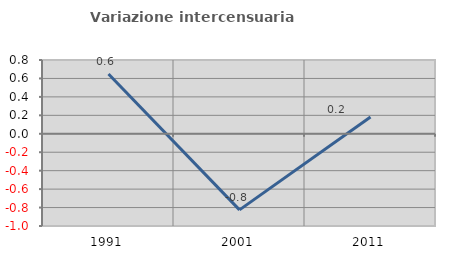
| Category | Variazione intercensuaria annua |
|---|---|
| 1991.0 | 0.649 |
| 2001.0 | -0.825 |
| 2011.0 | 0.182 |